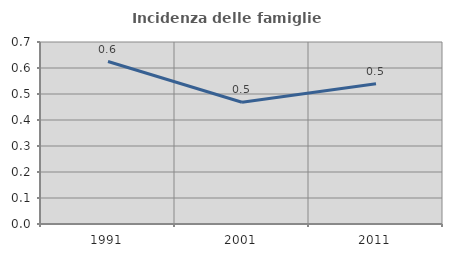
| Category | Incidenza delle famiglie numerose |
|---|---|
| 1991.0 | 0.625 |
| 2001.0 | 0.468 |
| 2011.0 | 0.539 |